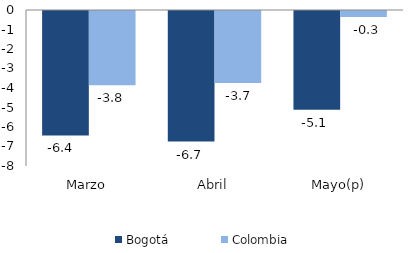
| Category | Bogotá | Colombia |
|---|---|---|
| Marzo | -6.384 | -3.811 |
| Abril | -6.694 | -3.695 |
| Mayo(p) | -5.063 | -0.314 |